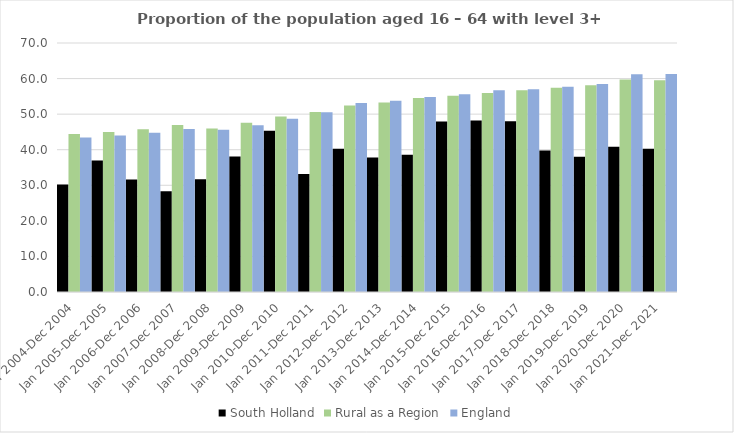
| Category | South Holland | Rural as a Region | England |
|---|---|---|---|
| Jan 2004-Dec 2004 | 30.2 | 44.405 | 43.4 |
| Jan 2005-Dec 2005 | 37 | 44.973 | 44 |
| Jan 2006-Dec 2006 | 31.6 | 45.774 | 44.8 |
| Jan 2007-Dec 2007 | 28.3 | 46.968 | 45.8 |
| Jan 2008-Dec 2008 | 31.7 | 45.964 | 45.6 |
| Jan 2009-Dec 2009 | 38.1 | 47.59 | 46.9 |
| Jan 2010-Dec 2010 | 45.3 | 49.362 | 48.7 |
| Jan 2011-Dec 2011 | 33.2 | 50.602 | 50.5 |
| Jan 2012-Dec 2012 | 40.3 | 52.439 | 53.1 |
| Jan 2013-Dec 2013 | 37.8 | 53.276 | 53.8 |
| Jan 2014-Dec 2014 | 38.6 | 54.57 | 54.8 |
| Jan 2015-Dec 2015 | 47.9 | 55.16 | 55.6 |
| Jan 2016-Dec 2016 | 48.2 | 55.941 | 56.7 |
| Jan 2017-Dec 2017 | 48 | 56.689 | 57 |
| Jan 2018-Dec 2018 | 39.8 | 57.389 | 57.7 |
| Jan 2019-Dec 2019 | 38 | 58.147 | 58.5 |
| Jan 2020-Dec 2020 | 40.8 | 59.771 | 61.2 |
| Jan 2021-Dec 2021 | 40.3 | 59.54 | 61.3 |